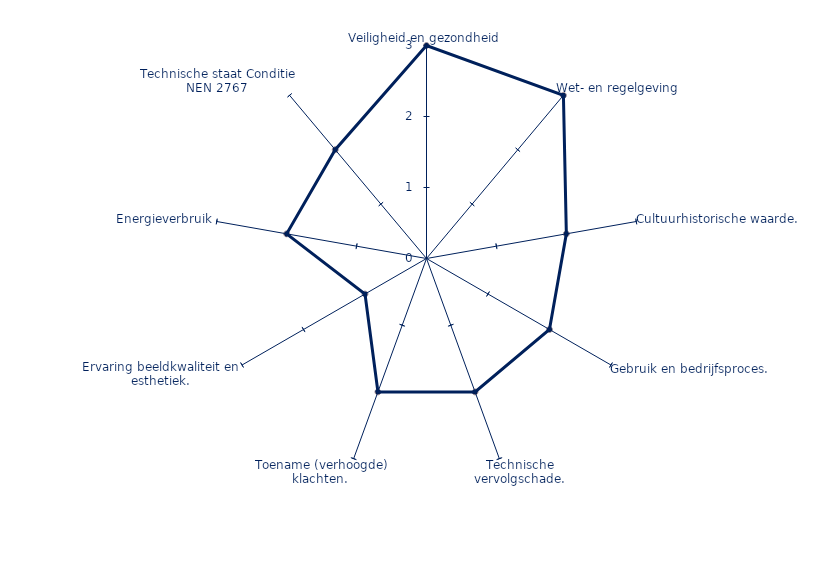
| Category | Series 0 |
|---|---|
| Veiligheid en gezondheid | 3 |
| Wet- en regelgeving | 3 |
| Cultuurhistorische waarde. | 2 |
| Gebruik en bedrijfsproces. | 2 |
| Technische vervolgschade. | 2 |
| Toename (verhoogde) klachten.  | 2 |
| Ervaring beeldkwaliteit en esthetiek. | 1 |
| Energieverbruik | 2 |
| Technische staat Conditie NEN 2767  | 2 |